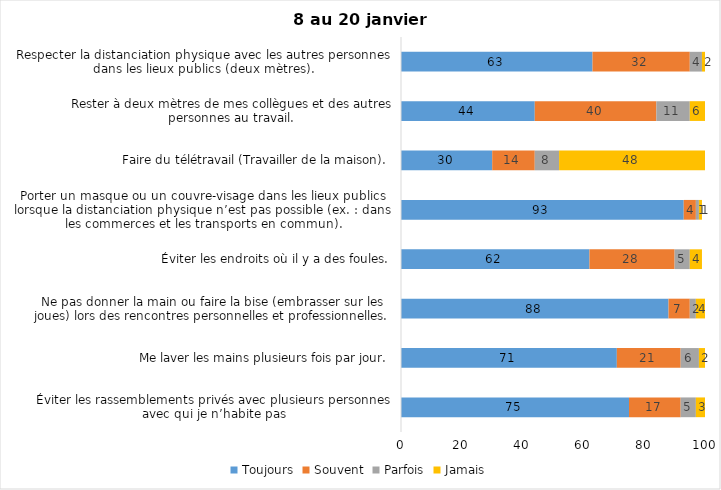
| Category | Toujours | Souvent | Parfois | Jamais |
|---|---|---|---|---|
| Éviter les rassemblements privés avec plusieurs personnes avec qui je n’habite pas | 75 | 17 | 5 | 3 |
| Me laver les mains plusieurs fois par jour. | 71 | 21 | 6 | 2 |
| Ne pas donner la main ou faire la bise (embrasser sur les joues) lors des rencontres personnelles et professionnelles. | 88 | 7 | 2 | 4 |
| Éviter les endroits où il y a des foules. | 62 | 28 | 5 | 4 |
| Porter un masque ou un couvre-visage dans les lieux publics lorsque la distanciation physique n’est pas possible (ex. : dans les commerces et les transports en commun). | 93 | 4 | 1 | 1 |
| Faire du télétravail (Travailler de la maison). | 30 | 14 | 8 | 48 |
| Rester à deux mètres de mes collègues et des autres personnes au travail. | 44 | 40 | 11 | 6 |
| Respecter la distanciation physique avec les autres personnes dans les lieux publics (deux mètres). | 63 | 32 | 4 | 2 |